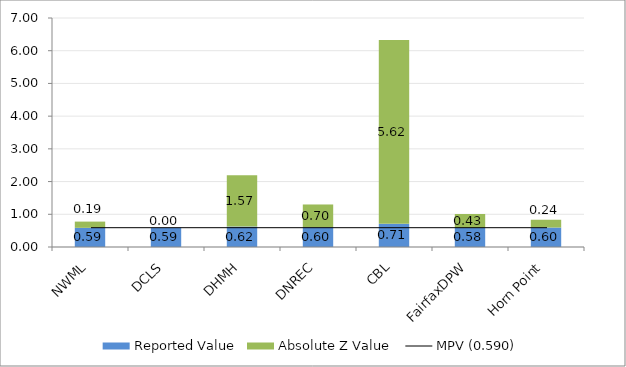
| Category | Reported Value | Absolute Z Value  |
|---|---|---|
| NWML | 0.586 | 0.19 |
| DCLS | 0.59 | 0 |
| DHMH | 0.623 | 1.571 |
| DNREC | 0.605 | 0.695 |
| CBL | 0.708 | 5.619 |
| FairfaxDPW | 0.581 | 0.429 |
| Horn Point | 0.595 | 0.238 |